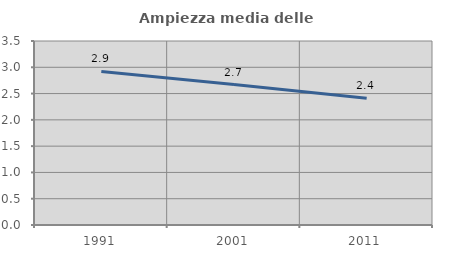
| Category | Ampiezza media delle famiglie |
|---|---|
| 1991.0 | 2.92 |
| 2001.0 | 2.672 |
| 2011.0 | 2.409 |